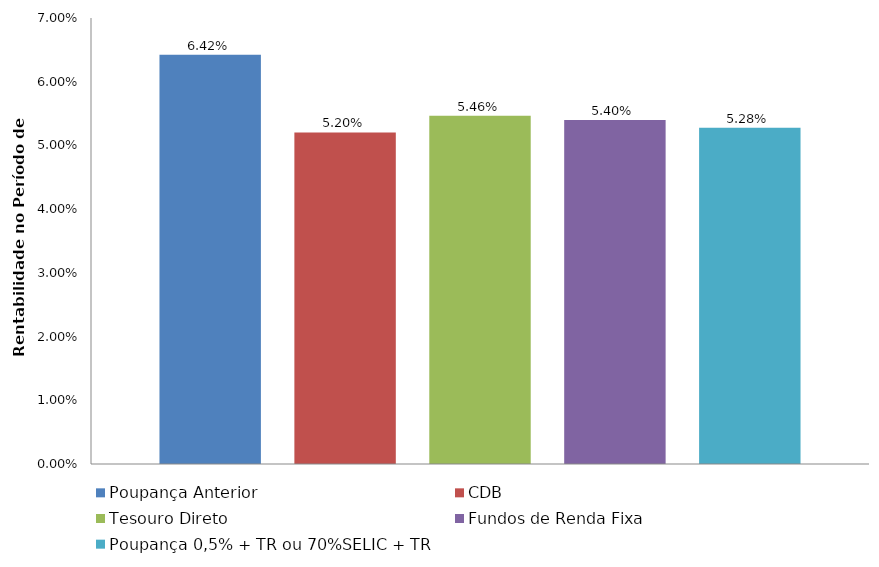
| Category | Poupança Anterior | CDB | Tesouro Direto | Fundos de Renda Fixa | Poupança 0,5% + TR ou 70%SELIC + TR |
|---|---|---|---|---|---|
| Poupança Anterior | 0.064 | 0.052 | 0.055 | 0.054 | 0.053 |